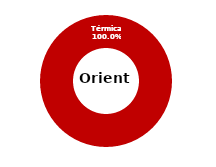
| Category | Oriente |
|---|---|
| Eólica | 0 |
| Hidráulica | 0 |
| Solar | 0 |
| Térmica | 37.603 |